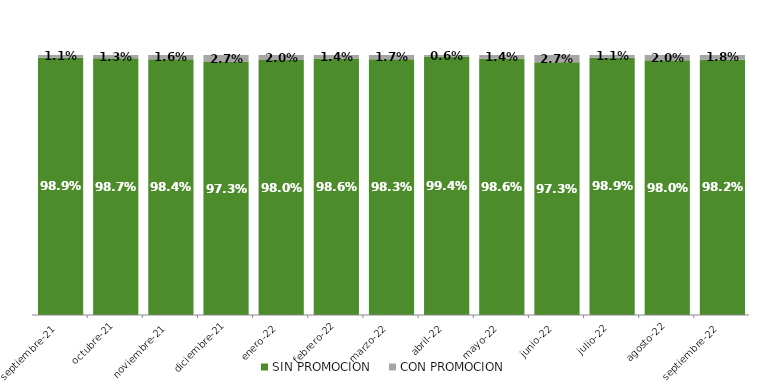
| Category | SIN PROMOCION   | CON PROMOCION   |
|---|---|---|
| 2021-09-01 | 0.989 | 0.011 |
| 2021-10-01 | 0.987 | 0.013 |
| 2021-11-01 | 0.984 | 0.016 |
| 2021-12-01 | 0.973 | 0.027 |
| 2022-01-01 | 0.98 | 0.02 |
| 2022-02-01 | 0.986 | 0.014 |
| 2022-03-01 | 0.983 | 0.017 |
| 2022-04-01 | 0.994 | 0.006 |
| 2022-05-01 | 0.986 | 0.014 |
| 2022-06-01 | 0.973 | 0.027 |
| 2022-07-01 | 0.989 | 0.011 |
| 2022-08-01 | 0.98 | 0.02 |
| 2022-09-01 | 0.982 | 0.018 |